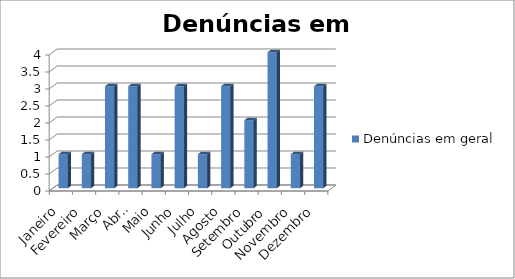
| Category | Denúncias em geral |
|---|---|
| Janeiro | 1 |
| Fevereiro | 1 |
| Março | 3 |
| Abril | 3 |
| Maio | 1 |
| Junho | 3 |
| Julho | 1 |
| Agosto | 3 |
| Setembro | 2 |
| Outubro | 4 |
| Novembro | 1 |
| Dezembro | 3 |